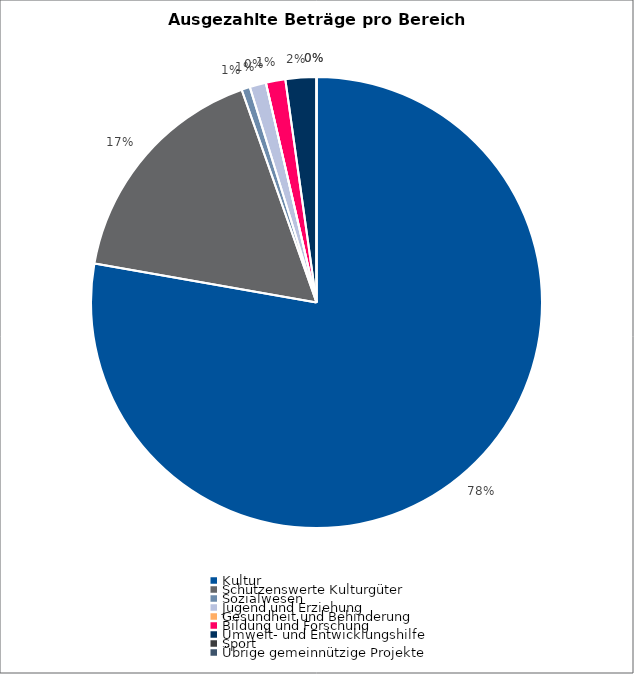
| Category | Series 0 |
|---|---|
| Kultur | 15720444.67 |
| Schützenswerte Kulturgüter | 3405944.79 |
| Sozialwesen | 122500 |
| Jugend und Erziehung | 236509.55 |
| Gesundheit und Behinderung | 0 |
| Bildung und Forschung | 281687.03 |
| Umwelt- und Entwicklungshilfe | 447500 |
| Sport | 0 |
| Übrige gemeinnützige Projekte | 0 |